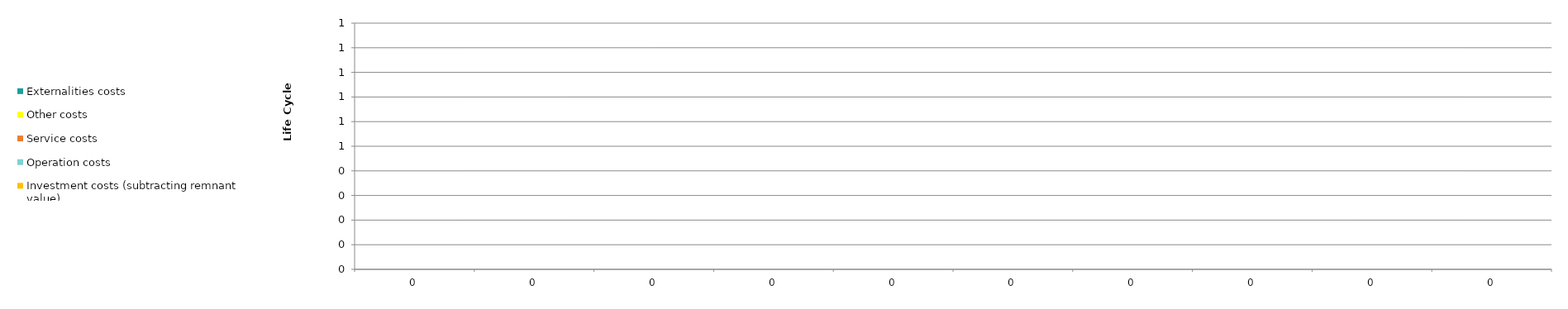
| Category | Investment costs (subtracting remnant value) | Operation costs | Service costs | Other costs | Externalities costs |
|---|---|---|---|---|---|
| 0.0 | 0 | 0 | 0 | 0 | 0 |
| 0.0 | 0 | 0 | 0 | 0 | 0 |
| 0.0 | 0 | 0 | 0 | 0 | 0 |
| 0.0 | 0 | 0 | 0 | 0 | 0 |
| 0.0 | 0 | 0 | 0 | 0 | 0 |
| 0.0 | 0 | 0 | 0 | 0 | 0 |
| 0.0 | 0 | 0 | 0 | 0 | 0 |
| 0.0 | 0 | 0 | 0 | 0 | 0 |
| 0.0 | 0 | 0 | 0 | 0 | 0 |
| 0.0 | 0 | 0 | 0 | 0 | 0 |